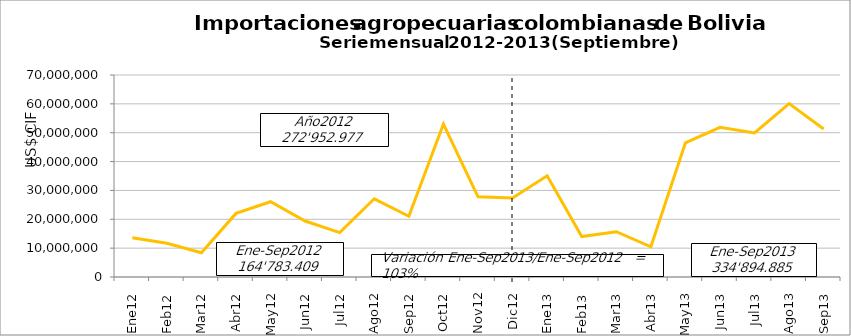
| Category | Series 0 |
|---|---|
| 0 | 13630100.28 |
| 1 | 11706548.25 |
| 2 | 8396579.71 |
| 3 | 22036418.65 |
| 4 | 26075485.68 |
| 5 | 19395567.17 |
| 6 | 15392785.62 |
| 7 | 27098373.62 |
| 8 | 21051550.18 |
| 9 | 52991212.69 |
| 10 | 27796660.4 |
| 11 | 27381694.45 |
| 12 | 35057561.26 |
| 13 | 14011104.23 |
| 14 | 15696651.69 |
| 15 | 10453694.51 |
| 16 | 46505801.63 |
| 17 | 51857466.34 |
| 18 | 49924098.26 |
| 19 | 60096543.56 |
| 20 | 51291963.51 |